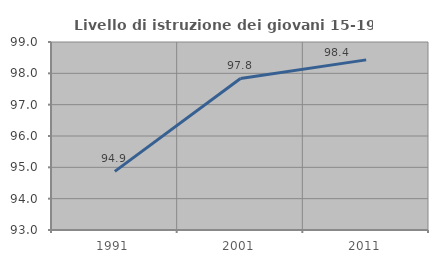
| Category | Livello di istruzione dei giovani 15-19 anni |
|---|---|
| 1991.0 | 94.87 |
| 2001.0 | 97.836 |
| 2011.0 | 98.43 |